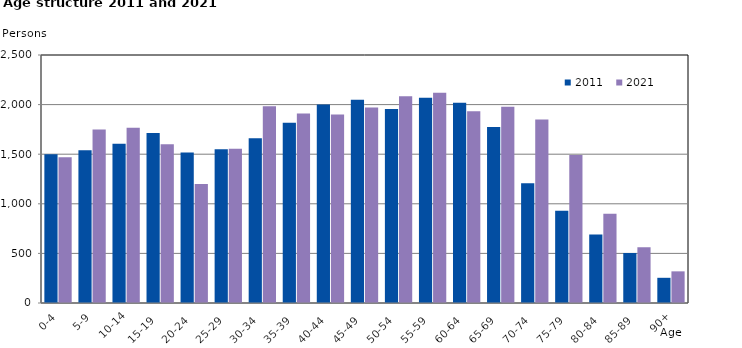
| Category | 2011 | 2021 |
|---|---|---|
|   0-4  | 1499 | 1469 |
|   5-9  | 1541 | 1749 |
| 10-14 | 1605 | 1767 |
| 15-19  | 1713 | 1601 |
| 20-24  | 1517 | 1200 |
| 25-29  | 1551 | 1556 |
| 30-34  | 1661 | 1984 |
| 35-39  | 1817 | 1911 |
| 40-44  | 2001 | 1899 |
| 45-49  | 2049 | 1972 |
| 50-54  | 1956 | 2084 |
| 55-59  | 2069 | 2120 |
| 60-64  | 2018 | 1932 |
| 65-69  | 1774 | 1978 |
| 70-74  | 1207 | 1850 |
| 75-79  | 929 | 1492 |
| 80-84  | 690 | 899 |
| 85-89  | 504 | 562 |
| 90+ | 254 | 319 |